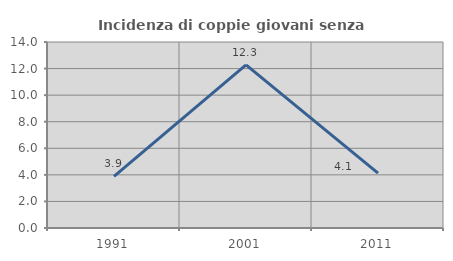
| Category | Incidenza di coppie giovani senza figli |
|---|---|
| 1991.0 | 3.883 |
| 2001.0 | 12.284 |
| 2011.0 | 4.137 |